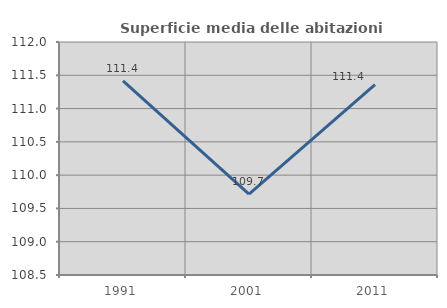
| Category | Superficie media delle abitazioni occupate |
|---|---|
| 1991.0 | 111.417 |
| 2001.0 | 109.714 |
| 2011.0 | 111.359 |